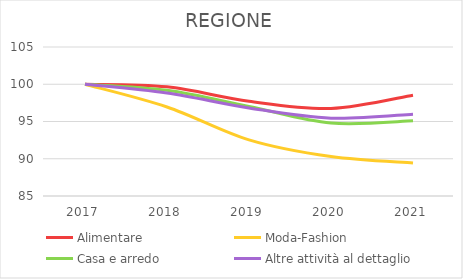
| Category | Alimentare | Moda-Fashion | Casa e arredo | Altre attività al dettaglio |
|---|---|---|---|---|
| 2017.0 | 100 | 100 | 100 | 100 |
| 2018.0 | 99.65 | 96.949 | 99.188 | 98.819 |
| 2019.0 | 97.712 | 92.533 | 97.022 | 96.817 |
| 2020.0 | 96.743 | 90.292 | 94.792 | 95.45 |
| 2021.0 | 98.522 | 89.428 | 95.095 | 95.981 |